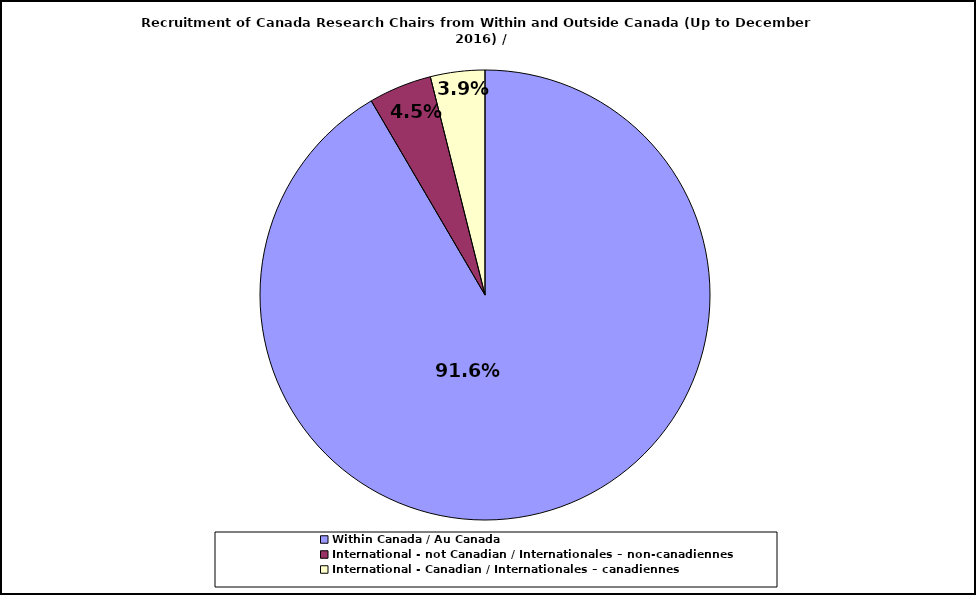
| Category | Series 0 |
|---|---|
| Within Canada / Au Canada | 0.916 |
| International - not Canadian / Internationales – non-canadiennes | 0.045 |
| International - Canadian / Internationales – canadiennes | 0.039 |